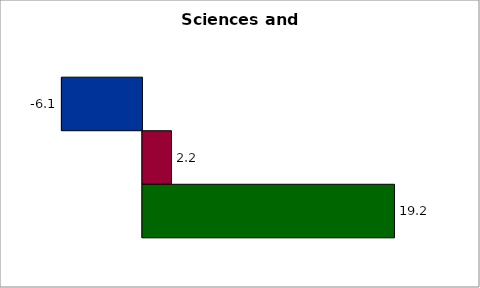
| Category | 50 states and D.C. | SREB states | Series 2 |
|---|---|---|---|
| 0 | -6.127 | 2.21 | 19.177 |